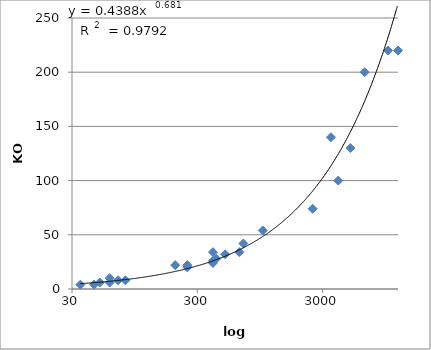
| Category | Series 0 |
|---|---|
| 35.0 | 4 |
| 45.0 | 4 |
| 50.0 | 6 |
| 60.0 | 6 |
| 60.0 | 10 |
| 70.0 | 8 |
| 80.0 | 8 |
| 200.0 | 22 |
| 250.0 | 20 |
| 250.0 | 22 |
| 400.0 | 26 |
| 400.0 | 24 |
| 400.0 | 34 |
| 425.0 | 28 |
| 500.0 | 32 |
| 650.0 | 34 |
| 700.0 | 42 |
| 1000.0 | 54 |
| 2500.0 | 74 |
| 3500.0 | 140 |
| 4000.0 | 100 |
| 5000.0 | 130 |
| 6500.0 | 200 |
| 10000.0 | 220 |
| 12000.0 | 220 |